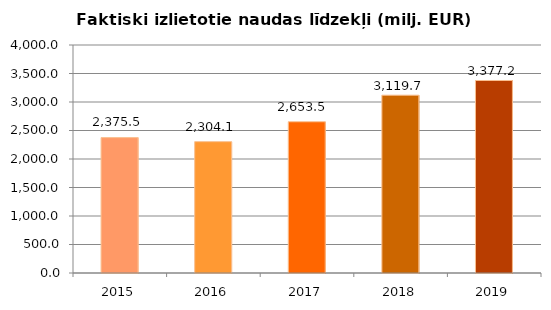
| Category | Faktiski izlietotie naudas līdzekļi (milj. EUR) ar PVN |
|---|---|
| 2015.0 | 2375.471 |
| 2016.0 | 2304.104 |
| 2017.0 | 2653.503 |
| 2018.0 | 3119.679 |
| 2019.0 | 3377.208 |